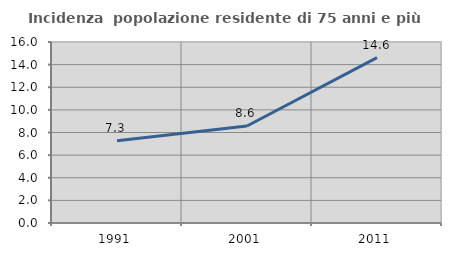
| Category | Incidenza  popolazione residente di 75 anni e più |
|---|---|
| 1991.0 | 7.277 |
| 2001.0 | 8.578 |
| 2011.0 | 14.613 |